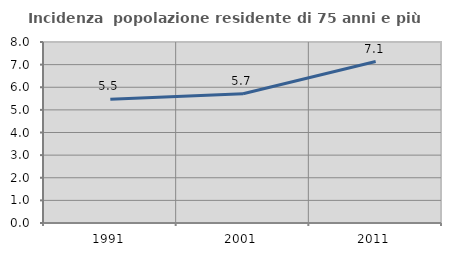
| Category | Incidenza  popolazione residente di 75 anni e più |
|---|---|
| 1991.0 | 5.465 |
| 2001.0 | 5.716 |
| 2011.0 | 7.135 |